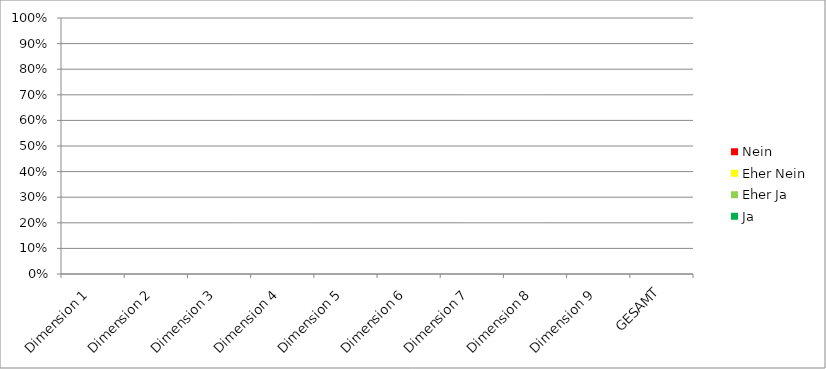
| Category | Ja | Eher Ja | Eher Nein | Nein |
|---|---|---|---|---|
| Dimension 1 | 0 | 0 | 0 | 0 |
| Dimension 2 | 0 | 0 | 0 | 0 |
| Dimension 3 | 0 | 0 | 0 | 0 |
| Dimension 4 | 0 | 0 | 0 | 0 |
| Dimension 5 | 0 | 0 | 0 | 0 |
| Dimension 6 | 0 | 0 | 0 | 0 |
| Dimension 7 | 0 | 0 | 0 | 0 |
| Dimension 8 | 0 | 0 | 0 | 0 |
| Dimension 9 | 0 | 0 | 0 | 0 |
| GESAMT | 0 | 0 | 0 | 0 |